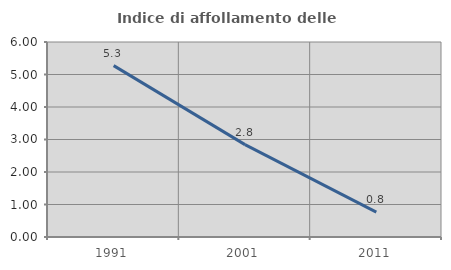
| Category | Indice di affollamento delle abitazioni  |
|---|---|
| 1991.0 | 5.272 |
| 2001.0 | 2.842 |
| 2011.0 | 0.765 |